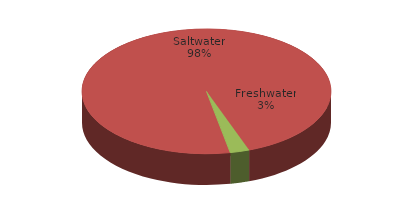
| Category | Series 0 |
|---|---|
| Freshwater | 10000 |
| Saltwater | 390000 |